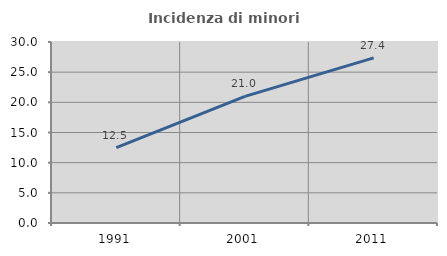
| Category | Incidenza di minori stranieri |
|---|---|
| 1991.0 | 12.5 |
| 2001.0 | 20.982 |
| 2011.0 | 27.374 |